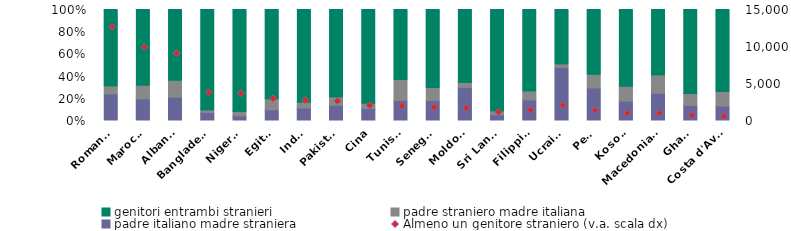
| Category | padre italiano madre straniera | padre straniero madre italiana | genitori entrambi stranieri |
|---|---|---|---|
| Romania | 3076 | 914 | 8728 |
| Marocco | 1961 | 1221 | 6783 |
| Albania | 1951 | 1400 | 5817 |
| Bangladesh | 286 | 90 | 3496 |
| Nigeria | 164 | 142 | 3454 |
| Egitto | 295 | 300 | 2450 |
| India | 322 | 151 | 2352 |
| Pakistan | 378 | 205 | 2132 |
| Cina | 234 | 102 | 1788 |
| Tunisia | 372 | 389 | 1299 |
| Senegal | 333 | 217 | 1297 |
| Moldova | 520 | 85 | 1147 |
| Sri Lanka | 65 | 44 | 1125 |
| Filippine | 274 | 116 | 1071 |
| Ucraina | 1038 | 71 | 1059 |
| Perù | 425 | 178 | 838 |
| Kosovo | 190 | 144 | 740 |
| Macedonia del Nord | 265 | 175 | 626 |
| Ghana | 102 | 80 | 564 |
| Costa d'Avorio | 84 | 83 | 468 |